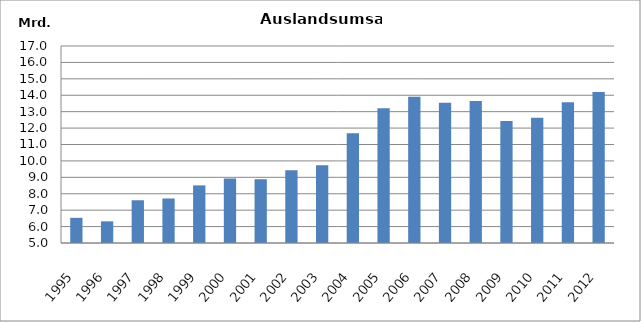
| Category | 1995 1996 1997 1998 1999 2000 2001 2002 2003 2004 2005 2006 2007 2008 2009 2010 2011 2012 |
|---|---|
| 1995 | 6532952 |
| 1996 | 6319142 |
| 1997 | 7603819 |
| 1998 | 7711587 |
| 1999 | 8508603 |
| 2000 | 8925754 |
| 2001 | 8885463 |
| 2002 | 9428713 |
| 2003 | 9733339 |
| 2004 | 11680546 |
| 2005 | 13208153 |
| 2006 | 13901521 |
| 2007 | 13537187 |
| 2008 | 13649884 |
| 2009 | 12432618 |
| 2010 | 12628416.402 |
| 2011 | 13577795 |
| 2012 | 14199097 |